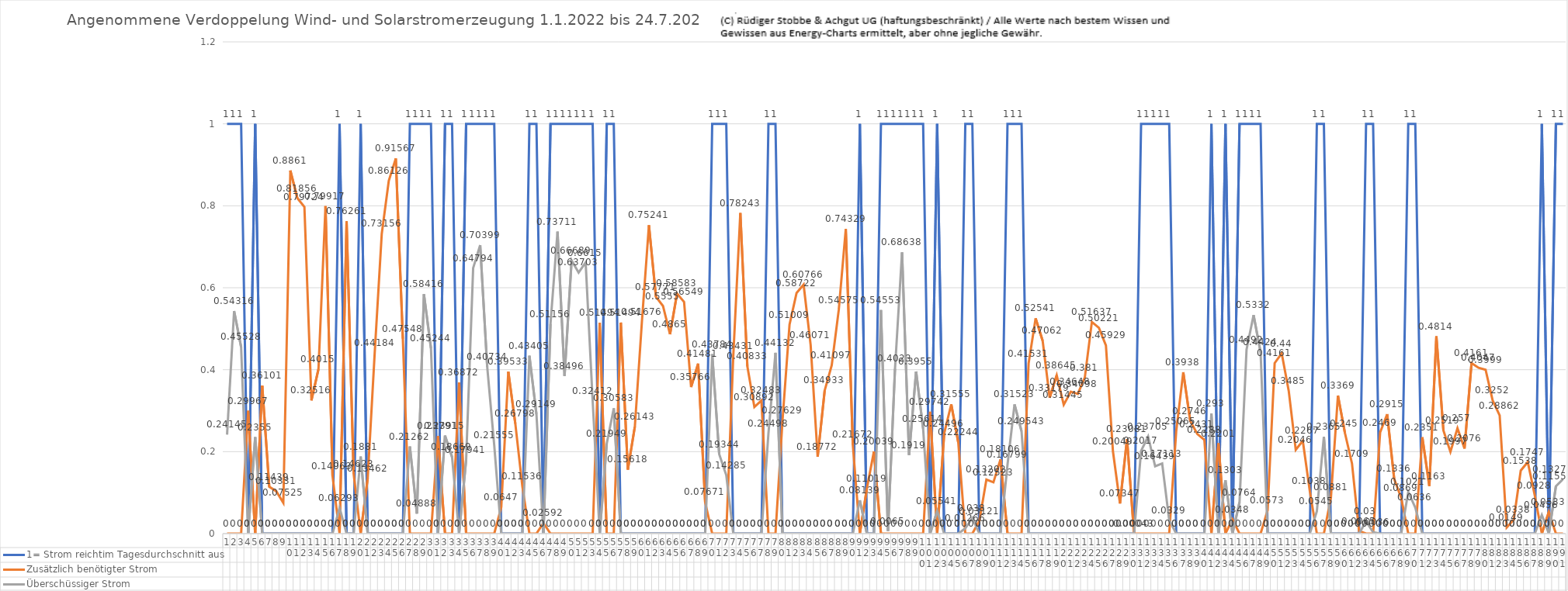
| Category | 1= Strom reichtim Tagesdurchschnitt aus | Zusätzlich benötigter Strom | Überschüssiger Strom |
|---|---|---|---|
| 0 | 1 | 0 | 0.241 |
| 1 | 1 | 0 | 0.543 |
| 2 | 1 | 0 | 0.455 |
| 3 | 0 | 0.3 | 0 |
| 4 | 1 | 0 | 0.236 |
| 5 | 0 | 0.361 | 0 |
| 6 | 0 | 0.114 | 0 |
| 7 | 0 | 0.103 | 0 |
| 8 | 0 | 0.075 | 0 |
| 9 | 0 | 0.886 | 0 |
| 10 | 0 | 0.819 | 0 |
| 11 | 0 | 0.797 | 0 |
| 12 | 0 | 0.325 | 0 |
| 13 | 0 | 0.402 | 0 |
| 14 | 0 | 0.799 | 0 |
| 15 | 0 | 0.141 | 0 |
| 16 | 1 | 0 | 0.063 |
| 17 | 0 | 0.763 | 0 |
| 18 | 0 | 0.146 | 0 |
| 19 | 1 | 0 | 0.188 |
| 20 | 0 | 0.135 | 0 |
| 21 | 0 | 0.442 | 0 |
| 22 | 0 | 0.732 | 0 |
| 23 | 0 | 0.861 | 0 |
| 24 | 0 | 0.916 | 0 |
| 25 | 0 | 0.475 | 0 |
| 26 | 1 | 0 | 0.213 |
| 27 | 1 | 0 | 0.049 |
| 28 | 1 | 0 | 0.584 |
| 29 | 1 | 0 | 0.452 |
| 30 | 0 | 0.238 | 0 |
| 31 | 1 | 0 | 0.239 |
| 32 | 1 | 0 | 0.187 |
| 33 | 0 | 0.369 | 0 |
| 34 | 1 | 0 | 0.179 |
| 35 | 1 | 0 | 0.648 |
| 36 | 1 | 0 | 0.704 |
| 37 | 1 | 0 | 0.407 |
| 38 | 1 | 0 | 0.216 |
| 39 | 0 | 0.065 | 0 |
| 40 | 0 | 0.395 | 0 |
| 41 | 0 | 0.268 | 0 |
| 42 | 0 | 0.115 | 0 |
| 43 | 1 | 0 | 0.434 |
| 44 | 1 | 0 | 0.291 |
| 45 | 0 | 0.026 | 0 |
| 46 | 1 | 0 | 0.512 |
| 47 | 1 | 0 | 0.737 |
| 48 | 1 | 0 | 0.385 |
| 49 | 1 | 0 | 0.667 |
| 50 | 1 | 0 | 0.637 |
| 51 | 1 | 0 | 0.661 |
| 52 | 1 | 0 | 0.324 |
| 53 | 0 | 0.515 | 0 |
| 54 | 1 | 0 | 0.219 |
| 55 | 1 | 0 | 0.306 |
| 56 | 0 | 0.515 | 0 |
| 57 | 0 | 0.156 | 0 |
| 58 | 0 | 0.261 | 0 |
| 59 | 0 | 0.517 | 0 |
| 60 | 0 | 0.752 | 0 |
| 61 | 0 | 0.578 | 0 |
| 62 | 0 | 0.556 | 0 |
| 63 | 0 | 0.487 | 0 |
| 64 | 0 | 0.586 | 0 |
| 65 | 0 | 0.565 | 0 |
| 66 | 0 | 0.358 | 0 |
| 67 | 0 | 0.415 | 0 |
| 68 | 0 | 0.077 | 0 |
| 69 | 1 | 0 | 0.438 |
| 70 | 1 | 0 | 0.193 |
| 71 | 1 | 0 | 0.143 |
| 72 | 0 | 0.434 | 0 |
| 73 | 0 | 0.782 | 0 |
| 74 | 0 | 0.408 | 0 |
| 75 | 0 | 0.309 | 0 |
| 76 | 0 | 0.325 | 0 |
| 77 | 1 | 0 | 0.245 |
| 78 | 1 | 0 | 0.441 |
| 79 | 0 | 0.276 | 0 |
| 80 | 0 | 0.51 | 0 |
| 81 | 0 | 0.587 | 0 |
| 82 | 0 | 0.608 | 0 |
| 83 | 0 | 0.461 | 0 |
| 84 | 0 | 0.188 | 0 |
| 85 | 0 | 0.349 | 0 |
| 86 | 0 | 0.411 | 0 |
| 87 | 0 | 0.546 | 0 |
| 88 | 0 | 0.743 | 0 |
| 89 | 0 | 0.217 | 0 |
| 90 | 1 | 0 | 0.081 |
| 91 | 0 | 0.11 | 0 |
| 92 | 0 | 0.2 | 0 |
| 93 | 1 | 0 | 0.546 |
| 94 | 1 | 0 | 0.006 |
| 95 | 1 | 0 | 0.402 |
| 96 | 1 | 0 | 0.686 |
| 97 | 1 | 0 | 0.192 |
| 98 | 1 | 0 | 0.396 |
| 99 | 1 | 0 | 0.256 |
| 100 | 0 | 0.297 | 0 |
| 101 | 1 | 0 | 0.055 |
| 102 | 0 | 0.245 | 0 |
| 103 | 0 | 0.316 | 0 |
| 104 | 0 | 0.222 | 0 |
| 105 | 1 | 0 | 0.013 |
| 106 | 1 | 0 | 0.038 |
| 107 | 0 | 0.031 | 0 |
| 108 | 0 | 0.132 | 0 |
| 109 | 0 | 0.125 | 0 |
| 110 | 0 | 0.181 | 0 |
| 111 | 1 | 0 | 0.168 |
| 112 | 1 | 0 | 0.315 |
| 113 | 1 | 0 | 0.25 |
| 114 | 0 | 0.415 | 0 |
| 115 | 0 | 0.525 | 0 |
| 116 | 0 | 0.471 | 0 |
| 117 | 0 | 0.332 | 0 |
| 118 | 0 | 0.386 | 0 |
| 119 | 0 | 0.314 | 0 |
| 120 | 0 | 0.346 | 0 |
| 121 | 0 | 0.341 | 0 |
| 122 | 0 | 0.381 | 0 |
| 123 | 0 | 0.516 | 0 |
| 124 | 0 | 0.502 | 0 |
| 125 | 0 | 0.459 | 0 |
| 126 | 0 | 0.2 | 0 |
| 127 | 0 | 0.073 | 0 |
| 128 | 0 | 0.231 | 0 |
| 129 | 0 | 0 | 0 |
| 130 | 1 | 0 | 0.202 |
| 131 | 1 | 0 | 0.237 |
| 132 | 1 | 0 | 0.164 |
| 133 | 1 | 0 | 0.171 |
| 134 | 1 | 0 | 0.033 |
| 135 | 0 | 0.251 | 0 |
| 136 | 0 | 0.394 | 0 |
| 137 | 0 | 0.275 | 0 |
| 138 | 0 | 0.243 | 0 |
| 139 | 0 | 0.229 | 0 |
| 140 | 1 | 0 | 0.293 |
| 141 | 0 | 0.22 | 0 |
| 142 | 1 | 0 | 0.13 |
| 143 | 0 | 0.035 | 0 |
| 144 | 1 | 0 | 0.076 |
| 145 | 1 | 0 | 0.449 |
| 146 | 1 | 0 | 0.533 |
| 147 | 1 | 0 | 0.442 |
| 148 | 0 | 0.057 | 0 |
| 149 | 0 | 0.416 | 0 |
| 150 | 0 | 0.44 | 0 |
| 151 | 0 | 0.348 | 0 |
| 152 | 0 | 0.205 | 0 |
| 153 | 0 | 0.227 | 0 |
| 154 | 0 | 0.104 | 0 |
| 155 | 1 | 0 | 0.054 |
| 156 | 1 | 0 | 0.237 |
| 157 | 0 | 0.088 | 0 |
| 158 | 0 | 0.337 | 0 |
| 159 | 0 | 0.245 | 0 |
| 160 | 0 | 0.171 | 0 |
| 161 | 0 | 0.007 | 0 |
| 162 | 1 | 0 | 0.03 |
| 163 | 1 | 0 | 0.004 |
| 164 | 0 | 0.247 | 0 |
| 165 | 0 | 0.292 | 0 |
| 166 | 0 | 0.134 | 0 |
| 167 | 0 | 0.087 | 0 |
| 168 | 1 | 0 | 0.102 |
| 169 | 1 | 0 | 0.064 |
| 170 | 0 | 0.235 | 0 |
| 171 | 0 | 0.116 | 0 |
| 172 | 0 | 0.481 | 0 |
| 173 | 0 | 0.252 | 0 |
| 174 | 0 | 0.2 | 0 |
| 175 | 0 | 0.257 | 0 |
| 176 | 0 | 0.208 | 0 |
| 177 | 0 | 0.416 | 0 |
| 178 | 0 | 0.405 | 0 |
| 179 | 0 | 0.4 | 0 |
| 180 | 0 | 0.325 | 0 |
| 181 | 0 | 0.289 | 0 |
| 182 | 0 | 0.015 | 0 |
| 183 | 0 | 0.034 | 0 |
| 184 | 0 | 0.154 | 0 |
| 185 | 0 | 0.175 | 0 |
| 186 | 0 | 0.093 | 0 |
| 187 | 1 | 0 | 0.046 |
| 188 | 0 | 0.053 | 0 |
| 189 | 1 | 0 | 0.115 |
| 190 | 1 | 0 | 0.133 |